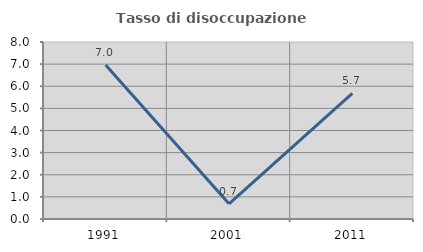
| Category | Tasso di disoccupazione giovanile  |
|---|---|
| 1991.0 | 6.965 |
| 2001.0 | 0.685 |
| 2011.0 | 5.674 |